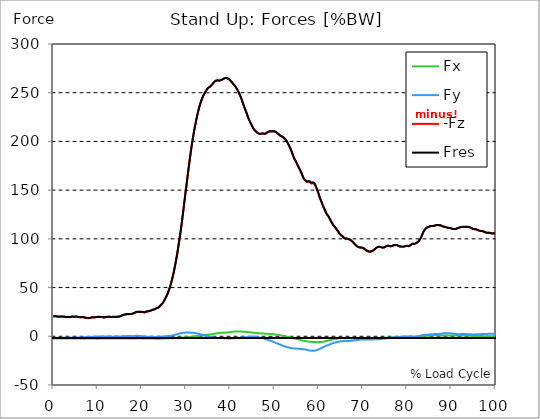
| Category |  Fx |  Fy |  -Fz |  Fres |
|---|---|---|---|---|
| 0.0 | -2.323 | -1.768 | 20.219 | 20.437 |
| 0.167348456675344 | -2.339 | -1.763 | 20.387 | 20.604 |
| 0.334696913350688 | -2.354 | -1.738 | 20.55 | 20.764 |
| 0.5020453700260321 | -2.347 | -1.685 | 20.47 | 20.68 |
| 0.669393826701376 | -2.339 | -1.659 | 20.357 | 20.565 |
| 0.83674228337672 | -2.32 | -1.626 | 20.266 | 20.47 |
| 1.0040907400520642 | -2.293 | -1.643 | 20.036 | 20.24 |
| 1.1621420602454444 | -2.293 | -1.702 | 19.957 | 20.168 |
| 1.3294905169207885 | -2.297 | -1.726 | 20.008 | 20.221 |
| 1.4968389735961325 | -2.299 | -1.734 | 20.081 | 20.294 |
| 1.6641874302714765 | -2.305 | -1.714 | 20.203 | 20.413 |
| 1.8315358869468206 | -2.297 | -1.655 | 20.259 | 20.463 |
| 1.9988843436221646 | -2.275 | -1.603 | 20.205 | 20.403 |
| 2.1662328002975086 | -2.254 | -1.587 | 20.135 | 20.33 |
| 2.333581256972853 | -2.243 | -1.596 | 19.992 | 20.188 |
| 2.5009297136481967 | -2.239 | -1.603 | 19.982 | 20.178 |
| 2.6682781703235405 | -2.218 | -1.53 | 19.881 | 20.07 |
| 2.8356266269988843 | -2.201 | -1.503 | 19.665 | 19.852 |
| 3.002975083674229 | -2.204 | -1.545 | 19.612 | 19.803 |
| 3.1703235403495724 | -2.226 | -1.559 | 19.72 | 19.914 |
| 3.337671997024917 | -2.24 | -1.514 | 19.791 | 19.981 |
| 3.4957233172182973 | -2.234 | -1.465 | 19.694 | 19.881 |
| 3.663071773893641 | -2.222 | -1.477 | 19.561 | 19.75 |
| 3.8304202305689854 | -2.254 | -1.535 | 19.695 | 19.89 |
| 3.997768687244329 | -2.284 | -1.572 | 19.924 | 20.121 |
| 4.165117143919673 | -2.299 | -1.525 | 20.094 | 20.289 |
| 4.332465600595017 | -2.299 | -1.459 | 20.139 | 20.329 |
| 4.499814057270361 | -2.294 | -1.446 | 20.013 | 20.201 |
| 4.667162513945706 | -2.297 | -1.465 | 19.857 | 20.05 |
| 4.834510970621049 | -2.319 | -1.475 | 19.937 | 20.134 |
| 5.001859427296393 | -2.332 | -1.471 | 20.067 | 20.265 |
| 5.169207883971737 | -2.338 | -1.409 | 20.169 | 20.363 |
| 5.336556340647081 | -2.312 | -1.295 | 20.059 | 20.244 |
| 5.503904797322425 | -2.299 | -1.288 | 19.855 | 20.04 |
| 5.671253253997769 | -2.31 | -1.236 | 19.698 | 19.883 |
| 5.82930457419115 | -2.31 | -1.24 | 19.444 | 19.631 |
| 5.996653030866494 | -2.31 | -1.249 | 19.415 | 19.604 |
| 6.164001487541838 | -2.319 | -1.235 | 19.436 | 19.627 |
| 6.331349944217181 | -2.338 | -1.214 | 19.489 | 19.681 |
| 6.498698400892526 | -2.361 | -1.166 | 19.539 | 19.733 |
| 6.66604685756787 | -2.401 | -1.121 | 19.543 | 19.739 |
| 6.833395314243213 | -2.435 | -1.052 | 19.476 | 19.674 |
| 7.000743770918558 | -2.437 | -0.972 | 19.295 | 19.49 |
| 7.168092227593902 | -2.436 | -0.91 | 19.123 | 19.316 |
| 7.335440684269246 | -2.419 | -0.894 | 18.897 | 19.089 |
| 7.50278914094459 | -2.404 | -0.862 | 18.742 | 18.933 |
| 7.6701375976199335 | -2.388 | -0.814 | 18.655 | 18.844 |
| 7.837486054295278 | -2.373 | -0.764 | 18.575 | 18.763 |
| 7.995537374488658 | -2.343 | -0.69 | 18.581 | 18.765 |
| 8.162885831164003 | -2.345 | -0.632 | 18.654 | 18.837 |
| 8.330234287839346 | -2.363 | -0.643 | 18.819 | 19.005 |
| 8.49758274451469 | -2.378 | -0.64 | 19.059 | 19.245 |
| 8.664931201190035 | -2.375 | -0.587 | 19.279 | 19.459 |
| 8.832279657865378 | -2.37 | -0.521 | 19.356 | 19.533 |
| 8.999628114540721 | -2.37 | -0.481 | 19.33 | 19.506 |
| 9.166976571216066 | -2.369 | -0.467 | 19.285 | 19.459 |
| 9.334325027891412 | -2.366 | -0.459 | 19.234 | 19.409 |
| 9.501673484566755 | -2.386 | -0.467 | 19.423 | 19.6 |
| 9.669021941242098 | -2.413 | -0.471 | 19.634 | 19.814 |
| 9.836370397917442 | -2.399 | -0.373 | 19.781 | 19.955 |
| 10.003718854592787 | -2.404 | -0.33 | 19.813 | 19.986 |
| 10.17106731126813 | -2.41 | -0.294 | 19.83 | 20.003 |
| 10.329118631461512 | -2.405 | -0.312 | 19.724 | 19.897 |
| 10.496467088136853 | -2.395 | -0.312 | 19.791 | 19.963 |
| 10.663815544812199 | -2.383 | -0.302 | 19.841 | 20.01 |
| 10.831164001487544 | -2.372 | -0.265 | 19.822 | 19.99 |
| 10.998512458162887 | -2.363 | -0.244 | 19.657 | 19.825 |
| 11.16586091483823 | -2.352 | -0.244 | 19.475 | 19.641 |
| 11.333209371513574 | -2.355 | -0.258 | 19.373 | 19.541 |
| 11.50055782818892 | -2.365 | -0.295 | 19.33 | 19.499 |
| 11.667906284864264 | -2.372 | -0.32 | 19.408 | 19.575 |
| 11.835254741539607 | -2.365 | -0.323 | 19.614 | 19.778 |
| 12.00260319821495 | -2.355 | -0.314 | 19.8 | 19.961 |
| 12.169951654890292 | -2.339 | -0.265 | 19.871 | 20.028 |
| 12.337300111565641 | -2.35 | -0.314 | 19.911 | 20.07 |
| 12.504648568240984 | -2.352 | -0.343 | 19.977 | 20.135 |
| 12.662699888434362 | -2.339 | -0.321 | 20.014 | 20.17 |
| 12.830048345109708 | -2.324 | -0.281 | 19.855 | 20.009 |
| 12.997396801785053 | -2.321 | -0.305 | 19.71 | 19.865 |
| 13.164745258460396 | -2.339 | -0.372 | 19.667 | 19.825 |
| 13.33209371513574 | -2.352 | -0.37 | 19.797 | 19.956 |
| 13.499442171811083 | -2.375 | -0.356 | 19.985 | 20.145 |
| 13.666790628486426 | -2.387 | -0.328 | 19.985 | 20.146 |
| 13.834139085161771 | -2.375 | -0.267 | 19.827 | 19.987 |
| 14.001487541837117 | -2.39 | -0.284 | 19.686 | 19.849 |
| 14.16883599851246 | -2.391 | -0.323 | 19.791 | 19.954 |
| 14.336184455187803 | -2.382 | -0.334 | 20.001 | 20.163 |
| 14.503532911863147 | -2.363 | -0.311 | 20.054 | 20.213 |
| 14.670881368538492 | -2.352 | -0.314 | 19.995 | 20.155 |
| 14.828932688731873 | -2.354 | -0.339 | 20.066 | 20.228 |
| 14.996281145407215 | -2.354 | -0.359 | 20.307 | 20.472 |
| 15.163629602082558 | -2.334 | -0.303 | 20.613 | 20.779 |
| 15.330978058757903 | -2.312 | -0.225 | 20.926 | 21.097 |
| 15.498326515433247 | -2.303 | -0.142 | 21.303 | 21.48 |
| 15.665674972108594 | -2.29 | -0.021 | 21.617 | 21.806 |
| 15.833023428783937 | -2.293 | 0.046 | 21.804 | 22.001 |
| 16.00037188545928 | -2.315 | 0.049 | 22.017 | 22.221 |
| 16.167720342134626 | -2.328 | 0.094 | 22.236 | 22.443 |
| 16.335068798809967 | -2.334 | 0.141 | 22.395 | 22.604 |
| 16.502417255485312 | -2.334 | 0.186 | 22.497 | 22.71 |
| 16.669765712160658 | -2.334 | 0.236 | 22.556 | 22.773 |
| 16.837114168836 | -2.342 | 0.227 | 22.502 | 22.721 |
| 17.004462625511344 | -2.355 | 0.187 | 22.525 | 22.747 |
| 17.16251394570472 | -2.338 | 0.208 | 22.72 | 22.945 |
| 17.32986240238007 | -2.328 | 0.258 | 22.694 | 22.923 |
| 17.497210859055414 | -2.342 | 0.221 | 22.612 | 22.845 |
| 17.664559315730756 | -2.374 | 0.159 | 22.683 | 22.921 |
| 17.8319077724061 | -2.395 | 0.128 | 22.925 | 23.172 |
| 17.999256229081443 | -2.408 | 0.126 | 23.253 | 23.503 |
| 18.166604685756788 | -2.417 | 0.134 | 23.556 | 23.817 |
| 18.333953142432133 | -2.39 | 0.227 | 23.88 | 24.16 |
| 18.501301599107478 | -2.324 | 0.352 | 24.241 | 24.537 |
| 18.668650055782823 | -2.232 | 0.446 | 24.606 | 24.91 |
| 18.835998512458165 | -2.154 | 0.477 | 24.754 | 25.057 |
| 19.00334696913351 | -2.068 | 0.49 | 24.902 | 25.204 |
| 19.170695425808855 | -2.037 | 0.479 | 25.001 | 25.295 |
| 19.338043882484197 | -2.074 | 0.394 | 24.947 | 25.234 |
| 19.496095202677576 | -2.094 | 0.354 | 25.019 | 25.303 |
| 19.66344365935292 | -2.114 | 0.299 | 24.981 | 25.258 |
| 19.830792116028263 | -2.15 | 0.156 | 24.818 | 25.077 |
| 19.998140572703612 | -2.186 | 0.09 | 24.866 | 25.124 |
| 20.165489029378953 | -2.225 | 0.014 | 24.774 | 25.026 |
| 20.3328374860543 | -2.263 | -0.119 | 24.608 | 24.845 |
| 20.500185942729644 | -2.28 | -0.232 | 24.44 | 24.668 |
| 20.667534399404985 | -2.288 | -0.324 | 24.507 | 24.734 |
| 20.83488285608033 | -2.326 | -0.412 | 24.803 | 25.037 |
| 21.002231312755672 | -2.347 | -0.41 | 25.169 | 25.404 |
| 21.16957976943102 | -2.351 | -0.385 | 25.396 | 25.627 |
| 21.336928226106362 | -2.365 | -0.408 | 25.541 | 25.774 |
| 21.504276682781704 | -2.368 | -0.435 | 25.622 | 25.857 |
| 21.67162513945705 | -2.357 | -0.467 | 25.636 | 25.874 |
| 21.82967645965043 | -2.373 | -0.556 | 25.825 | 26.067 |
| 21.997024916325774 | -2.395 | -0.614 | 26.195 | 26.44 |
| 22.16437337300112 | -2.403 | -0.612 | 26.668 | 26.91 |
| 22.33172182967646 | -2.404 | -0.575 | 26.983 | 27.221 |
| 22.499070286351806 | -2.39 | -0.572 | 27.048 | 27.284 |
| 22.666418743027148 | -2.387 | -0.617 | 27.197 | 27.435 |
| 22.833767199702496 | -2.409 | -0.634 | 27.507 | 27.743 |
| 23.00111565637784 | -2.43 | -0.667 | 27.844 | 28.081 |
| 23.168464113053183 | -2.443 | -0.677 | 28.302 | 28.539 |
| 23.335812569728528 | -2.453 | -0.636 | 28.697 | 28.93 |
| 23.50316102640387 | -2.448 | -0.606 | 28.964 | 29.194 |
| 23.670509483079215 | -2.435 | -0.579 | 29.212 | 29.437 |
| 23.83785793975456 | -2.445 | -0.596 | 29.655 | 29.881 |
| 23.995909259947936 | -2.44 | -0.586 | 30.453 | 30.672 |
| 24.163257716623285 | -2.425 | -0.516 | 31.323 | 31.533 |
| 24.330606173298627 | -2.378 | -0.406 | 32.166 | 32.365 |
| 24.49795462997397 | -2.338 | -0.35 | 32.921 | 33.11 |
| 24.665303086649313 | -2.301 | -0.299 | 33.667 | 33.845 |
| 24.83265154332466 | -2.288 | -0.275 | 34.712 | 34.885 |
| 25.0 | -2.259 | -0.263 | 35.986 | 36.152 |
| 25.167348456675345 | -2.228 | -0.201 | 37.465 | 37.623 |
| 25.334696913350694 | -2.185 | -0.13 | 38.975 | 39.12 |
| 25.502045370026035 | -2.126 | -0.009 | 40.43 | 40.561 |
| 25.669393826701377 | -2.083 | 0.11 | 41.88 | 42.001 |
| 25.836742283376722 | -2.093 | 0.186 | 43.702 | 43.817 |
| 26.004090740052067 | -2.108 | 0.267 | 45.695 | 45.805 |
| 26.17143919672741 | -2.134 | 0.303 | 47.815 | 47.92 |
| 26.329490516920792 | -2.148 | 0.31 | 50.041 | 50.139 |
| 26.49683897359613 | -2.112 | 0.401 | 52.622 | 52.716 |
| 26.66418743027148 | -2.055 | 0.561 | 55.355 | 55.445 |
| 26.831535886946828 | -1.983 | 0.686 | 58.252 | 58.342 |
| 26.998884343622166 | -1.889 | 0.879 | 61.354 | 61.443 |
| 27.166232800297514 | -1.788 | 1.072 | 64.657 | 64.747 |
| 27.333581256972852 | -1.71 | 1.239 | 68.209 | 68.299 |
| 27.5009297136482 | -1.627 | 1.479 | 72.09 | 72.185 |
| 27.668278170323543 | -1.56 | 1.738 | 76.08 | 76.182 |
| 27.835626626998888 | -1.502 | 1.96 | 80.235 | 80.339 |
| 28.002975083674233 | -1.459 | 2.172 | 84.726 | 84.834 |
| 28.170323540349575 | -1.444 | 2.413 | 89.439 | 89.551 |
| 28.33767199702492 | -1.431 | 2.628 | 94.404 | 94.519 |
| 28.50502045370026 | -1.428 | 2.827 | 99.391 | 99.508 |
| 28.663071773893645 | -1.453 | 3.012 | 104.302 | 104.421 |
| 28.830420230568986 | -1.501 | 3.146 | 109.486 | 109.603 |
| 28.99776868724433 | -1.515 | 3.28 | 115.045 | 115.16 |
| 29.165117143919673 | -1.426 | 3.44 | 121.09 | 121.204 |
| 29.33246560059502 | -1.377 | 3.535 | 127.234 | 127.342 |
| 29.499814057270367 | -1.337 | 3.632 | 133.263 | 133.369 |
| 29.66716251394571 | -1.262 | 3.71 | 139.459 | 139.563 |
| 29.834510970621054 | -1.185 | 3.797 | 145.868 | 145.969 |
| 30.00185942729639 | -1.143 | 3.85 | 151.715 | 151.813 |
| 30.169207883971744 | -1.043 | 3.897 | 157.677 | 157.773 |
| 30.33655634064708 | -0.919 | 3.93 | 163.723 | 163.814 |
| 30.50390479732243 | -0.815 | 3.929 | 169.75 | 169.837 |
| 30.671253253997772 | -0.73 | 3.915 | 175.653 | 175.737 |
| 30.829304574191156 | -0.658 | 3.853 | 181.316 | 181.395 |
| 30.996653030866494 | -0.591 | 3.768 | 186.899 | 186.975 |
| 31.164001487541842 | -0.515 | 3.725 | 192.172 | 192.246 |
| 31.331349944217187 | -0.419 | 3.685 | 197.19 | 197.262 |
| 31.498698400892525 | -0.31 | 3.603 | 202.062 | 202.134 |
| 31.666046857567874 | -0.192 | 3.502 | 206.677 | 206.748 |
| 31.833395314243212 | -0.08 | 3.423 | 210.926 | 210.996 |
| 32.00074377091856 | 0.025 | 3.368 | 214.912 | 214.982 |
| 32.1680922275939 | 0.123 | 3.285 | 218.726 | 218.795 |
| 32.33544068426925 | 0.214 | 3.072 | 222.515 | 222.581 |
| 32.50278914094459 | 0.305 | 2.87 | 226.119 | 226.183 |
| 32.670137597619934 | 0.395 | 2.703 | 229.454 | 229.516 |
| 32.83748605429528 | 0.488 | 2.537 | 232.519 | 232.579 |
| 33.004834510970625 | 0.587 | 2.382 | 235.288 | 235.346 |
| 33.162885831164004 | 0.671 | 2.188 | 237.848 | 237.906 |
| 33.33023428783935 | 0.733 | 1.947 | 240.234 | 240.289 |
| 33.497582744514695 | 0.804 | 1.708 | 242.445 | 242.497 |
| 33.664931201190036 | 0.912 | 1.486 | 244.425 | 244.475 |
| 33.83227965786538 | 1.005 | 1.262 | 246.212 | 246.259 |
| 33.99962811454073 | 1.071 | 1.035 | 247.795 | 247.84 |
| 34.16697657121607 | 1.152 | 0.845 | 249.203 | 249.245 |
| 34.33432502789141 | 1.214 | 0.625 | 250.556 | 250.597 |
| 34.50167348456676 | 1.319 | 0.437 | 251.748 | 251.79 |
| 34.6690219412421 | 1.435 | 0.24 | 252.95 | 252.991 |
| 34.83637039791744 | 1.55 | 0.043 | 254.151 | 254.191 |
| 35.00371885459279 | 1.637 | -0.154 | 254.987 | 255.027 |
| 35.17106731126814 | 1.729 | -0.286 | 255.475 | 255.515 |
| 35.338415767943474 | 1.766 | -0.37 | 255.686 | 255.725 |
| 35.49646708813686 | 1.84 | -0.55 | 256.382 | 256.418 |
| 35.6638155448122 | 1.948 | -0.714 | 257.194 | 257.228 |
| 35.831164001487544 | 2.089 | -0.853 | 258.101 | 258.135 |
| 35.998512458162885 | 2.196 | -1.031 | 259.035 | 259.07 |
| 36.165860914838234 | 2.335 | -1.23 | 259.999 | 260.034 |
| 36.333209371513576 | 2.526 | -1.356 | 260.844 | 260.879 |
| 36.50055782818892 | 2.686 | -1.506 | 261.56 | 261.597 |
| 36.667906284864266 | 2.808 | -1.636 | 262.089 | 262.129 |
| 36.83525474153961 | 2.955 | -1.743 | 262.508 | 262.55 |
| 37.002603198214956 | 3.088 | -1.817 | 262.714 | 262.757 |
| 37.1699516548903 | 3.208 | -1.79 | 262.655 | 262.701 |
| 37.337300111565646 | 3.293 | -1.763 | 262.489 | 262.535 |
| 37.50464856824098 | 3.328 | -1.765 | 262.375 | 262.422 |
| 37.66269988843437 | 3.441 | -1.742 | 262.582 | 262.631 |
| 37.83004834510971 | 3.503 | -1.755 | 262.815 | 262.866 |
| 37.99739680178505 | 3.578 | -1.768 | 263.045 | 263.097 |
| 38.16474525846039 | 3.661 | -1.76 | 263.345 | 263.396 |
| 38.33209371513574 | 3.672 | -1.799 | 263.837 | 263.889 |
| 38.49944217181109 | 3.671 | -1.901 | 264.36 | 264.412 |
| 38.666790628486424 | 3.67 | -2.03 | 264.828 | 264.88 |
| 38.83413908516178 | 3.717 | -2.107 | 265.034 | 265.085 |
| 39.001487541837115 | 3.863 | -2.11 | 265.105 | 265.159 |
| 39.16883599851246 | 3.915 | -2.188 | 265.071 | 265.125 |
| 39.336184455187805 | 3.961 | -2.286 | 264.844 | 264.899 |
| 39.503532911863154 | 4.046 | -2.317 | 264.443 | 264.498 |
| 39.670881368538495 | 4.092 | -2.357 | 263.923 | 263.978 |
| 39.83822982521384 | 4.141 | -2.399 | 263.317 | 263.374 |
| 39.996281145407224 | 4.265 | -2.377 | 262.516 | 262.574 |
| 40.163629602082565 | 4.374 | -2.357 | 261.707 | 261.766 |
| 40.33097805875791 | 4.465 | -2.325 | 260.87 | 260.93 |
| 40.498326515433256 | 4.634 | -2.19 | 259.961 | 260.026 |
| 40.6656749721086 | 4.748 | -2.072 | 259.065 | 259.13 |
| 40.83302342878393 | 4.828 | -1.988 | 258.179 | 258.246 |
| 41.00037188545929 | 4.89 | -1.923 | 257.301 | 257.369 |
| 41.16772034213463 | 4.919 | -1.826 | 256.268 | 256.339 |
| 41.33506879880997 | 4.933 | -1.813 | 255.043 | 255.115 |
| 41.50241725548531 | 4.912 | -1.83 | 253.751 | 253.823 |
| 41.66976571216066 | 4.925 | -1.71 | 252.435 | 252.508 |
| 41.837114168836 | 4.919 | -1.634 | 250.943 | 251.018 |
| 42.004462625511344 | 4.916 | -1.539 | 249.298 | 249.373 |
| 42.17181108218669 | 4.877 | -1.511 | 247.654 | 247.732 |
| 42.32986240238007 | 4.839 | -1.454 | 245.908 | 245.987 |
| 42.497210859055414 | 4.813 | -1.359 | 243.99 | 244.07 |
| 42.66455931573076 | 4.796 | -1.191 | 241.884 | 241.964 |
| 42.831907772406105 | 4.772 | -1.009 | 239.569 | 239.649 |
| 42.999256229081446 | 4.738 | -0.868 | 237.29 | 237.37 |
| 43.16660468575679 | 4.674 | -0.853 | 235.312 | 235.396 |
| 43.33395314243214 | 4.582 | -0.894 | 233.366 | 233.452 |
| 43.50130159910748 | 4.474 | -0.97 | 231.347 | 231.435 |
| 43.66865005578282 | 4.388 | -0.924 | 229.326 | 229.415 |
| 43.83599851245817 | 4.29 | -0.875 | 227.298 | 227.386 |
| 44.00334696913351 | 4.231 | -0.804 | 225.009 | 225.095 |
| 44.17069542580886 | 4.166 | -0.706 | 223.067 | 223.155 |
| 44.3380438824842 | 4.103 | -0.592 | 221.412 | 221.498 |
| 44.49609520267758 | 4.041 | -0.541 | 219.862 | 219.951 |
| 44.66344365935292 | 3.983 | -0.454 | 218.298 | 218.386 |
| 44.83079211602827 | 3.908 | -0.342 | 216.768 | 216.857 |
| 44.99814057270361 | 3.808 | -0.29 | 215.257 | 215.343 |
| 45.16548902937895 | 3.692 | -0.294 | 213.672 | 213.757 |
| 45.332837486054295 | 3.599 | -0.382 | 212.458 | 212.545 |
| 45.500185942729644 | 3.526 | -0.444 | 211.659 | 211.745 |
| 45.66753439940499 | 3.437 | -0.565 | 210.77 | 210.854 |
| 45.83488285608033 | 3.348 | -0.689 | 209.906 | 209.988 |
| 46.00223131275568 | 3.265 | -0.837 | 209.252 | 209.334 |
| 46.16957976943102 | 3.174 | -0.974 | 208.526 | 208.609 |
| 46.336928226106366 | 3.123 | -1.094 | 208.156 | 208.24 |
| 46.50427668278171 | 3.076 | -1.192 | 207.861 | 207.945 |
| 46.671625139457056 | 3.028 | -1.303 | 207.632 | 207.716 |
| 46.829676459650436 | 3.012 | -1.422 | 207.72 | 207.804 |
| 46.99702491632577 | 2.988 | -1.561 | 207.893 | 207.975 |
| 47.16437337300112 | 2.954 | -1.73 | 208.111 | 208.194 |
| 47.33172182967646 | 2.894 | -1.92 | 208.152 | 208.234 |
| 47.49907028635181 | 2.832 | -2.112 | 208.086 | 208.169 |
| 47.66641874302716 | 2.741 | -2.315 | 207.845 | 207.929 |
| 47.83376719970249 | 2.641 | -2.539 | 207.686 | 207.77 |
| 48.001115656377834 | 2.597 | -2.81 | 208.043 | 208.128 |
| 48.16846411305319 | 2.587 | -3.101 | 208.568 | 208.655 |
| 48.33581256972853 | 2.57 | -3.39 | 209.067 | 209.156 |
| 48.50316102640387 | 2.545 | -3.679 | 209.521 | 209.614 |
| 48.67050948307921 | 2.51 | -3.942 | 209.89 | 209.986 |
| 48.837857939754564 | 2.466 | -4.179 | 210.174 | 210.271 |
| 49.005206396429905 | 2.425 | -4.423 | 210.435 | 210.532 |
| 49.163257716623285 | 2.382 | -4.69 | 210.461 | 210.561 |
| 49.33060617329863 | 2.297 | -4.943 | 210.197 | 210.301 |
| 49.49795462997397 | 2.215 | -5.236 | 210.284 | 210.391 |
| 49.66530308664932 | 2.125 | -5.528 | 210.399 | 210.508 |
| 49.832651543324666 | 2.014 | -5.871 | 210.314 | 210.427 |
| 50.0 | 1.901 | -6.225 | 210.195 | 210.315 |
| 50.16734845667534 | 1.809 | -6.551 | 210.025 | 210.151 |
| 50.33469691335069 | 1.737 | -6.849 | 209.695 | 209.83 |
| 50.50204537002604 | 1.64 | -7.102 | 208.991 | 209.133 |
| 50.66939382670139 | 1.526 | -7.403 | 208.337 | 208.486 |
| 50.836742283376715 | 1.401 | -7.715 | 207.67 | 207.828 |
| 51.00409074005207 | 1.248 | -8.061 | 206.969 | 207.139 |
| 51.17143919672741 | 1.086 | -8.386 | 206.315 | 206.497 |
| 51.32949051692079 | 0.924 | -8.695 | 205.724 | 205.917 |
| 51.496838973596134 | 0.787 | -9.009 | 205.488 | 205.694 |
| 51.66418743027148 | 0.671 | -9.302 | 205.037 | 205.258 |
| 51.831535886946824 | 0.539 | -9.586 | 204.511 | 204.747 |
| 51.99888434362217 | 0.439 | -9.883 | 203.996 | 204.245 |
| 52.16623280029752 | 0.323 | -10.17 | 203.347 | 203.612 |
| 52.33358125697285 | 0.177 | -10.449 | 202.619 | 202.899 |
| 52.5009297136482 | 0.01 | -10.69 | 201.693 | 201.988 |
| 52.668278170323546 | -0.155 | -10.907 | 200.68 | 200.99 |
| 52.835626626998895 | -0.31 | -11.097 | 199.523 | 199.844 |
| 53.00297508367424 | -0.479 | -11.294 | 198.094 | 198.43 |
| 53.17032354034958 | -0.64 | -11.489 | 196.603 | 196.954 |
| 53.33767199702492 | -0.792 | -11.686 | 195.111 | 195.477 |
| 53.50502045370027 | -0.952 | -11.875 | 193.515 | 193.895 |
| 53.663071773893655 | -1.121 | -12.045 | 191.751 | 192.145 |
| 53.83042023056899 | -1.312 | -12.201 | 189.839 | 190.248 |
| 53.99776868724433 | -1.516 | -12.325 | 187.852 | 188.276 |
| 54.16511714391967 | -1.726 | -12.408 | 185.769 | 186.205 |
| 54.33246560059503 | -1.952 | -12.448 | 183.645 | 184.09 |
| 54.49981405727037 | -2.16 | -12.516 | 181.919 | 182.374 |
| 54.667162513945705 | -2.365 | -12.615 | 180.535 | 181.004 |
| 54.834510970621054 | -2.548 | -12.641 | 179.208 | 179.683 |
| 55.0018594272964 | -2.752 | -12.657 | 177.799 | 178.284 |
| 55.169207883971744 | -2.947 | -12.712 | 176.018 | 176.516 |
| 55.336556340647086 | -3.13 | -12.792 | 174.25 | 174.763 |
| 55.50390479732243 | -3.32 | -12.926 | 172.88 | 173.408 |
| 55.671253253997776 | -3.51 | -13.035 | 171.432 | 171.974 |
| 55.83860171067312 | -3.703 | -13.037 | 169.677 | 170.228 |
| 55.9966530308665 | -3.894 | -13.133 | 168.159 | 168.726 |
| 56.16400148754184 | -4.103 | -13.23 | 166.348 | 166.933 |
| 56.33134994421718 | -4.288 | -13.249 | 164.387 | 164.985 |
| 56.498698400892536 | -4.44 | -13.252 | 162.564 | 163.17 |
| 56.66604685756788 | -4.596 | -13.262 | 161.196 | 161.813 |
| 56.83339531424321 | -4.763 | -13.332 | 160.221 | 160.853 |
| 57.00074377091856 | -4.945 | -13.51 | 159.458 | 160.115 |
| 57.16809222759391 | -5.107 | -13.68 | 158.745 | 159.427 |
| 57.33544068426925 | -5.222 | -13.861 | 158.236 | 158.946 |
| 57.5027891409446 | -5.316 | -14.11 | 158.219 | 158.961 |
| 57.670137597619934 | -5.4 | -14.391 | 158.601 | 159.377 |
| 57.83748605429528 | -5.488 | -14.639 | 158.928 | 159.733 |
| 58.004834510970625 | -5.592 | -14.707 | 158.271 | 159.093 |
| 58.16288583116401 | -5.68 | -14.804 | 157.756 | 158.599 |
| 58.330234287839346 | -5.742 | -14.723 | 156.686 | 157.533 |
| 58.497582744514695 | -5.83 | -14.797 | 157.31 | 158.165 |
| 58.66493120119004 | -5.937 | -14.863 | 157.227 | 158.092 |
| 58.832279657865385 | -6.005 | -14.893 | 157.139 | 158.01 |
| 58.999628114540734 | -5.99 | -14.788 | 156.372 | 157.236 |
| 59.16697657121607 | -5.968 | -14.63 | 155.223 | 156.077 |
| 59.33432502789142 | -5.991 | -14.436 | 153.493 | 154.335 |
| 59.50167348456676 | -6.005 | -14.222 | 151.612 | 152.444 |
| 59.66902194124211 | -6.036 | -13.985 | 149.665 | 150.485 |
| 59.83637039791745 | -6.086 | -13.781 | 147.676 | 148.488 |
| 60.00371885459278 | -6.034 | -13.436 | 145.4 | 146.186 |
| 60.17106731126813 | -5.91 | -12.988 | 142.888 | 143.632 |
| 60.33841576794349 | -5.88 | -12.628 | 140.81 | 141.526 |
| 60.49646708813685 | -5.832 | -12.294 | 138.992 | 139.684 |
| 60.6638155448122 | -5.746 | -11.932 | 136.987 | 137.65 |
| 60.831164001487544 | -5.639 | -11.564 | 135.008 | 135.643 |
| 60.99851245816289 | -5.572 | -11.236 | 133.25 | 133.862 |
| 61.16586091483824 | -5.486 | -10.892 | 131.556 | 132.141 |
| 61.333209371513576 | -5.337 | -10.495 | 129.788 | 130.341 |
| 61.50055782818892 | -5.166 | -10.093 | 128.035 | 128.555 |
| 61.667906284864266 | -4.994 | -9.711 | 126.339 | 126.83 |
| 61.835254741539615 | -4.803 | -9.425 | 125.062 | 125.528 |
| 62.002603198214956 | -4.6 | -9.213 | 124.112 | 124.559 |
| 62.16995165489029 | -4.396 | -8.99 | 123.107 | 123.534 |
| 62.33730011156564 | -4.187 | -8.703 | 121.782 | 122.186 |
| 62.504648568240995 | -3.986 | -8.427 | 120.36 | 120.743 |
| 62.67199702491633 | -3.786 | -8.058 | 118.862 | 119.219 |
| 62.83004834510971 | -3.591 | -7.694 | 117.49 | 117.821 |
| 62.99739680178505 | -3.377 | -7.35 | 116.188 | 116.495 |
| 63.1647452584604 | -3.179 | -6.999 | 114.899 | 115.182 |
| 63.33209371513575 | -3.006 | -6.755 | 113.8 | 114.067 |
| 63.4994421718111 | -2.859 | -6.583 | 112.868 | 113.125 |
| 63.666790628486424 | -2.715 | -6.414 | 111.934 | 112.181 |
| 63.83413908516177 | -2.594 | -6.299 | 110.96 | 111.2 |
| 64.00148754183712 | -2.472 | -6.185 | 109.986 | 110.221 |
| 64.16883599851248 | -2.368 | -6.097 | 108.985 | 109.215 |
| 64.3361844551878 | -2.265 | -5.929 | 107.79 | 108.01 |
| 64.50353291186315 | -2.186 | -5.679 | 106.587 | 106.796 |
| 64.6708813685385 | -2.117 | -5.439 | 105.484 | 105.684 |
| 64.83822982521384 | -2.023 | -5.175 | 104.556 | 104.743 |
| 65.00557828188919 | -1.948 | -5.008 | 103.799 | 103.977 |
| 65.16362960208257 | -1.84 | -5.043 | 103.359 | 103.539 |
| 65.3309780587579 | -1.812 | -4.997 | 102.689 | 102.87 |
| 65.49832651543326 | -1.839 | -4.935 | 101.889 | 102.072 |
| 65.6656749721086 | -1.822 | -4.775 | 101.105 | 101.285 |
| 65.83302342878395 | -1.813 | -4.619 | 100.454 | 100.627 |
| 66.00037188545929 | -1.724 | -4.605 | 100.194 | 100.368 |
| 66.16772034213463 | -1.708 | -4.791 | 100.25 | 100.437 |
| 66.33506879880998 | -1.761 | -4.929 | 100.21 | 100.41 |
| 66.50241725548531 | -1.822 | -4.996 | 100 | 100.212 |
| 66.66976571216065 | -1.795 | -4.902 | 99.591 | 99.8 |
| 66.83711416883601 | -1.832 | -4.935 | 99.523 | 99.737 |
| 67.00446262551135 | -1.855 | -4.906 | 99.257 | 99.471 |
| 67.1718110821867 | -1.894 | -4.822 | 98.795 | 99.008 |
| 67.32986240238007 | -1.946 | -4.692 | 98.183 | 98.391 |
| 67.49721085905541 | -1.981 | -4.539 | 97.545 | 97.746 |
| 67.66455931573076 | -1.995 | -4.399 | 96.867 | 97.063 |
| 67.83190777240611 | -1.987 | -4.265 | 96.083 | 96.275 |
| 67.99925622908145 | -1.982 | -4.172 | 95.23 | 95.418 |
| 68.16660468575678 | -2.003 | -4.105 | 94.401 | 94.588 |
| 68.33395314243214 | -2.04 | -4.049 | 93.591 | 93.777 |
| 68.50130159910749 | -2.065 | -3.977 | 92.87 | 93.053 |
| 68.66865005578282 | -2.085 | -3.893 | 92.231 | 92.409 |
| 68.83599851245816 | -2.092 | -3.8 | 91.721 | 91.894 |
| 69.00334696913352 | -2.093 | -3.685 | 91.374 | 91.542 |
| 69.17069542580886 | -2.084 | -3.555 | 91.199 | 91.359 |
| 69.3380438824842 | -2.079 | -3.428 | 91.097 | 91.25 |
| 69.50539233915956 | -2.037 | -3.363 | 91.059 | 91.206 |
| 69.66344365935292 | -2.013 | -3.365 | 91.015 | 91.163 |
| 69.83079211602826 | -1.988 | -3.368 | 90.973 | 91.119 |
| 69.99814057270362 | -1.995 | -3.36 | 90.666 | 90.809 |
| 70.16548902937896 | -2.031 | -3.311 | 90.237 | 90.377 |
| 70.33283748605429 | -2.075 | -3.307 | 89.663 | 89.801 |
| 70.50018594272964 | -2.13 | -3.312 | 89.07 | 89.206 |
| 70.667534399405 | -2.196 | -3.294 | 88.43 | 88.568 |
| 70.83488285608033 | -2.267 | -3.329 | 87.859 | 87.999 |
| 71.00223131275568 | -2.312 | -3.305 | 87.517 | 87.655 |
| 71.16957976943102 | -2.355 | -3.328 | 87.191 | 87.33 |
| 71.33692822610637 | -2.387 | -3.363 | 86.899 | 87.041 |
| 71.50427668278171 | -2.394 | -3.342 | 86.801 | 86.945 |
| 71.67162513945706 | -2.404 | -3.339 | 86.83 | 86.973 |
| 71.8389735961324 | -2.405 | -3.306 | 87.012 | 87.154 |
| 71.99702491632577 | -2.414 | -3.244 | 87.245 | 87.383 |
| 72.16437337300113 | -2.395 | -3.19 | 87.65 | 87.786 |
| 72.33172182967647 | -2.365 | -3.154 | 88.094 | 88.227 |
| 72.49907028635181 | -2.337 | -3.114 | 88.659 | 88.787 |
| 72.66641874302715 | -2.302 | -3.093 | 89.231 | 89.357 |
| 72.8337671997025 | -2.234 | -3.059 | 89.877 | 89.997 |
| 73.00111565637783 | -2.145 | -3 | 90.579 | 90.694 |
| 73.16846411305319 | -2.066 | -2.947 | 91.093 | 91.201 |
| 73.33581256972853 | -1.997 | -2.933 | 91.55 | 91.654 |
| 73.50316102640387 | -1.963 | -2.99 | 91.822 | 91.925 |
| 73.67050948307921 | -1.942 | -2.972 | 91.867 | 91.969 |
| 73.83785793975457 | -1.937 | -2.956 | 91.778 | 91.877 |
| 74.00520639642991 | -1.934 | -2.908 | 91.586 | 91.685 |
| 74.16325771662328 | -1.93 | -2.794 | 91.341 | 91.437 |
| 74.33060617329863 | -1.92 | -2.667 | 91.106 | 91.2 |
| 74.49795462997398 | -1.876 | -2.525 | 90.963 | 91.053 |
| 74.66530308664932 | -1.826 | -2.419 | 91.012 | 91.097 |
| 74.83265154332466 | -1.716 | -2.324 | 91.227 | 91.311 |
| 75.00000000000001 | -1.608 | -2.237 | 91.652 | 91.733 |
| 75.16734845667534 | -1.506 | -2.159 | 92.146 | 92.226 |
| 75.3346969133507 | -1.446 | -2.025 | 92.634 | 92.712 |
| 75.50204537002605 | -1.432 | -1.889 | 92.903 | 92.983 |
| 75.66939382670138 | -1.441 | -1.812 | 92.973 | 93.052 |
| 75.83674228337672 | -1.434 | -1.805 | 92.83 | 92.907 |
| 76.00409074005208 | -1.476 | -1.739 | 92.498 | 92.573 |
| 76.17143919672742 | -1.511 | -1.685 | 92.32 | 92.394 |
| 76.33878765340276 | -1.49 | -1.56 | 92.377 | 92.452 |
| 76.49683897359614 | -1.445 | -1.434 | 92.521 | 92.594 |
| 76.66418743027148 | -1.366 | -1.328 | 92.83 | 92.901 |
| 76.83153588694682 | -1.288 | -1.223 | 93.219 | 93.293 |
| 76.99888434362218 | -1.213 | -1.123 | 93.56 | 93.635 |
| 77.16623280029752 | -1.215 | -1.081 | 93.476 | 93.551 |
| 77.33358125697285 | -1.221 | -1.049 | 93.479 | 93.554 |
| 77.5009297136482 | -1.177 | -0.992 | 93.613 | 93.688 |
| 77.66827817032356 | -1.139 | -0.932 | 93.628 | 93.703 |
| 77.83562662699889 | -1.161 | -0.87 | 93.328 | 93.404 |
| 78.00297508367423 | -1.196 | -0.788 | 92.859 | 92.935 |
| 78.17032354034959 | -1.215 | -0.719 | 92.359 | 92.435 |
| 78.33767199702493 | -1.225 | -0.644 | 92.028 | 92.105 |
| 78.50502045370027 | -1.212 | -0.55 | 91.955 | 92.031 |
| 78.67236891037561 | -1.139 | -0.481 | 92.045 | 92.121 |
| 78.83042023056899 | -1.107 | -0.454 | 92.063 | 92.138 |
| 78.99776868724433 | -1.148 | -0.421 | 91.893 | 91.969 |
| 79.16511714391969 | -1.16 | -0.374 | 91.825 | 91.899 |
| 79.33246560059503 | -1.119 | -0.317 | 92.018 | 92.09 |
| 79.49981405727036 | -1.058 | -0.276 | 92.383 | 92.453 |
| 79.66716251394571 | -0.999 | -0.263 | 92.708 | 92.778 |
| 79.83451097062107 | -0.994 | -0.319 | 92.843 | 92.912 |
| 80.00185942729641 | -1.026 | -0.341 | 92.772 | 92.841 |
| 80.16920788397174 | -1.059 | -0.341 | 92.53 | 92.599 |
| 80.33655634064709 | -1.075 | -0.323 | 92.449 | 92.515 |
| 80.50390479732243 | -1.045 | -0.288 | 92.729 | 92.794 |
| 80.67125325399778 | -0.973 | -0.293 | 93.213 | 93.279 |
| 80.83860171067312 | -0.872 | -0.283 | 93.886 | 93.954 |
| 80.99665303086651 | -0.791 | -0.279 | 94.453 | 94.521 |
| 81.16400148754184 | -0.768 | -0.295 | 94.71 | 94.777 |
| 81.3313499442172 | -0.757 | -0.263 | 94.932 | 94.997 |
| 81.49869840089255 | -0.792 | -0.25 | 94.848 | 94.912 |
| 81.66604685756786 | -0.827 | -0.236 | 94.756 | 94.822 |
| 81.83339531424322 | -0.791 | -0.186 | 95.044 | 95.108 |
| 82.00074377091858 | -0.719 | -0.137 | 95.554 | 95.618 |
| 82.16809222759392 | -0.659 | -0.117 | 96.057 | 96.121 |
| 82.33544068426926 | -0.612 | -0.117 | 96.538 | 96.601 |
| 82.50278914094459 | -0.566 | -0.019 | 97.17 | 97.23 |
| 82.67013759761994 | -0.519 | 0.175 | 97.988 | 98.043 |
| 82.83748605429528 | -0.445 | 0.395 | 98.988 | 99.039 |
| 83.00483451097062 | -0.328 | 0.675 | 100.272 | 100.319 |
| 83.17218296764597 | -0.201 | 0.874 | 101.57 | 101.615 |
| 83.33023428783935 | 0.005 | 1.045 | 103.52 | 103.566 |
| 83.4975827445147 | 0.201 | 1.2 | 105.436 | 105.485 |
| 83.66493120119004 | 0.352 | 1.311 | 107.183 | 107.234 |
| 83.83227965786537 | 0.431 | 1.375 | 108.526 | 108.577 |
| 83.99962811454073 | 0.528 | 1.503 | 109.529 | 109.581 |
| 84.16697657121607 | 0.588 | 1.586 | 110.359 | 110.41 |
| 84.33432502789142 | 0.564 | 1.628 | 110.951 | 111.003 |
| 84.50167348456677 | 0.552 | 1.646 | 111.585 | 111.637 |
| 84.6690219412421 | 0.569 | 1.662 | 112.068 | 112.121 |
| 84.83637039791745 | 0.577 | 1.684 | 112.271 | 112.325 |
| 85.0037188545928 | 0.626 | 1.792 | 112.528 | 112.586 |
| 85.17106731126813 | 0.699 | 1.943 | 112.875 | 112.938 |
| 85.33841576794349 | 0.747 | 2.021 | 113.12 | 113.187 |
| 85.50576422461883 | 0.8 | 2.054 | 113.161 | 113.232 |
| 85.66381554481221 | 0.844 | 2.129 | 113.137 | 113.21 |
| 85.83116400148755 | 0.905 | 2.174 | 113.218 | 113.295 |
| 85.99851245816289 | 0.988 | 2.255 | 113.368 | 113.452 |
| 86.16586091483823 | 1.018 | 2.323 | 113.39 | 113.477 |
| 86.33320937151358 | 1.036 | 2.354 | 113.657 | 113.746 |
| 86.50055782818893 | 1.065 | 2.385 | 113.986 | 114.077 |
| 86.66790628486427 | 1.077 | 2.4 | 114.177 | 114.27 |
| 86.83525474153961 | 1.054 | 2.401 | 114.205 | 114.298 |
| 87.00260319821496 | 1.001 | 2.396 | 114.134 | 114.227 |
| 87.16995165489031 | 0.938 | 2.436 | 113.995 | 114.089 |
| 87.33730011156564 | 0.895 | 2.47 | 113.898 | 113.992 |
| 87.504648568241 | 0.902 | 2.484 | 113.897 | 113.991 |
| 87.67199702491634 | 0.898 | 2.57 | 113.617 | 113.711 |
| 87.83004834510972 | 0.889 | 2.692 | 113.208 | 113.302 |
| 87.99739680178506 | 0.874 | 2.812 | 112.834 | 112.928 |
| 88.1647452584604 | 0.883 | 2.964 | 112.534 | 112.631 |
| 88.33209371513574 | 0.894 | 3.059 | 112.357 | 112.455 |
| 88.49944217181108 | 0.897 | 3.079 | 112.271 | 112.368 |
| 88.66679062848644 | 0.895 | 3.138 | 112.077 | 112.174 |
| 88.83413908516178 | 0.888 | 3.199 | 111.819 | 111.919 |
| 89.00148754183712 | 0.845 | 3.111 | 111.462 | 111.555 |
| 89.16883599851246 | 0.839 | 3.116 | 111.276 | 111.368 |
| 89.33618445518782 | 0.853 | 3.138 | 111.145 | 111.237 |
| 89.50353291186315 | 0.894 | 3.191 | 111.157 | 111.252 |
| 89.6708813685385 | 0.91 | 3.205 | 111.093 | 111.188 |
| 89.83822982521386 | 0.907 | 3.185 | 111.019 | 111.114 |
| 90.00557828188919 | 0.874 | 3.085 | 110.845 | 110.934 |
| 90.16362960208257 | 0.757 | 2.792 | 110.262 | 110.339 |
| 90.3309780587579 | 0.711 | 2.63 | 110.015 | 110.088 |
| 90.49832651543326 | 0.724 | 2.577 | 110.044 | 110.114 |
| 90.66567497210859 | 0.741 | 2.581 | 109.968 | 110.039 |
| 90.83302342878395 | 0.745 | 2.443 | 109.986 | 110.055 |
| 91.00037188545929 | 0.738 | 2.334 | 110.138 | 110.205 |
| 91.16772034213463 | 0.741 | 2.295 | 110.465 | 110.533 |
| 91.33506879880998 | 0.761 | 2.225 | 110.919 | 110.987 |
| 91.50241725548533 | 0.761 | 2.191 | 111.145 | 111.213 |
| 91.66976571216065 | 0.735 | 2.186 | 111.36 | 111.428 |
| 91.83711416883601 | 0.743 | 2.204 | 111.596 | 111.665 |
| 92.00446262551137 | 0.757 | 2.219 | 111.852 | 111.921 |
| 92.1718110821867 | 0.768 | 2.232 | 112.117 | 112.187 |
| 92.33915953886203 | 0.775 | 2.254 | 112.21 | 112.283 |
| 92.49721085905541 | 0.782 | 2.276 | 112.28 | 112.355 |
| 92.66455931573077 | 0.787 | 2.306 | 112.289 | 112.366 |
| 92.83190777240611 | 0.756 | 2.301 | 112.299 | 112.377 |
| 92.99925622908145 | 0.721 | 2.28 | 112.295 | 112.373 |
| 93.1666046857568 | 0.706 | 2.235 | 112.24 | 112.316 |
| 93.33395314243214 | 0.697 | 2.213 | 112.248 | 112.321 |
| 93.50130159910749 | 0.692 | 2.201 | 112.292 | 112.364 |
| 93.66865005578283 | 0.676 | 2.155 | 112.334 | 112.405 |
| 93.83599851245818 | 0.663 | 2.12 | 112.266 | 112.335 |
| 94.00334696913353 | 0.627 | 2.076 | 112.059 | 112.129 |
| 94.17069542580886 | 0.581 | 2.026 | 111.854 | 111.925 |
| 94.3380438824842 | 0.582 | 2.021 | 111.663 | 111.733 |
| 94.50539233915954 | 0.539 | 1.992 | 111.194 | 111.262 |
| 94.66344365935292 | 0.463 | 1.942 | 110.561 | 110.628 |
| 94.83079211602828 | 0.394 | 1.916 | 110.08 | 110.146 |
| 94.99814057270362 | 0.345 | 1.928 | 109.901 | 109.966 |
| 95.16548902937897 | 0.341 | 1.952 | 109.934 | 109.997 |
| 95.33283748605432 | 0.345 | 1.957 | 109.889 | 109.951 |
| 95.50018594272963 | 0.37 | 1.965 | 109.818 | 109.879 |
| 95.66753439940499 | 0.394 | 2.004 | 109.663 | 109.723 |
| 95.83488285608034 | 0.355 | 2.019 | 109.253 | 109.312 |
| 96.00223131275567 | 0.271 | 2.035 | 108.826 | 108.885 |
| 96.16957976943102 | 0.258 | 2.057 | 108.631 | 108.689 |
| 96.33692822610638 | 0.219 | 2.086 | 108.408 | 108.466 |
| 96.50427668278171 | 0.177 | 2.143 | 108.15 | 108.208 |
| 96.67162513945706 | 0.166 | 2.206 | 108.085 | 108.143 |
| 96.8389735961324 | 0.173 | 2.276 | 108.052 | 108.111 |
| 96.99702491632577 | 0.185 | 2.283 | 107.946 | 108.004 |
| 97.16437337300111 | 0.174 | 2.261 | 107.726 | 107.783 |
| 97.33172182967647 | 0.16 | 2.248 | 107.445 | 107.501 |
| 97.49907028635181 | 0.112 | 2.232 | 107.086 | 107.141 |
| 97.66641874302715 | 0.083 | 2.246 | 106.775 | 106.83 |
| 97.8337671997025 | 0.072 | 2.288 | 106.505 | 106.56 |
| 98.00111565637785 | 0.017 | 2.337 | 106.275 | 106.329 |
| 98.16846411305319 | -0.044 | 2.4 | 106.117 | 106.174 |
| 98.33581256972855 | -0.04 | 2.486 | 106.181 | 106.239 |
| 98.50316102640389 | -0.014 | 2.559 | 106.295 | 106.354 |
| 98.67050948307921 | -0.01 | 2.579 | 106.196 | 106.255 |
| 98.83785793975456 | -0.03 | 2.6 | 105.876 | 105.938 |
| 99.0052063964299 | -0.049 | 2.621 | 105.556 | 105.619 |
| 99.17255485310525 | -0.053 | 2.649 | 105.506 | 105.568 |
| 99.33060617329863 | -0.003 | 2.676 | 105.641 | 105.705 |
| 99.49795462997399 | 0.049 | 2.683 | 105.699 | 105.763 |
| 99.66530308664933 | 0.072 | 2.65 | 105.621 | 105.683 |
| 99.83265154332467 | 0.066 | 2.604 | 105.428 | 105.489 |
| 100.0 | 0.049 | 2.551 | 105.165 | 105.226 |